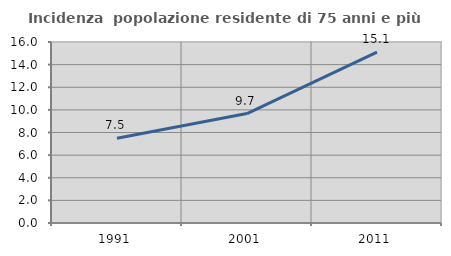
| Category | Incidenza  popolazione residente di 75 anni e più |
|---|---|
| 1991.0 | 7.494 |
| 2001.0 | 9.675 |
| 2011.0 | 15.105 |